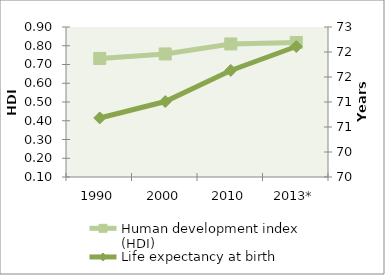
| Category | Human development index (HDI) |
|---|---|
| 1990 | 0.732 |
| 2000 | 0.756 |
| 2010 | 0.81 |
| 2013* | 0.818 |